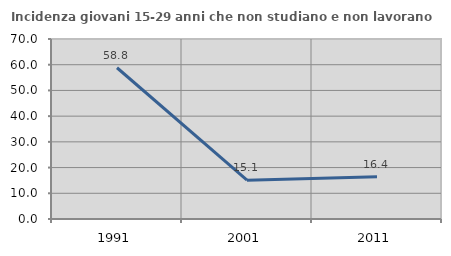
| Category | Incidenza giovani 15-29 anni che non studiano e non lavorano  |
|---|---|
| 1991.0 | 58.819 |
| 2001.0 | 15.116 |
| 2011.0 | 16.418 |